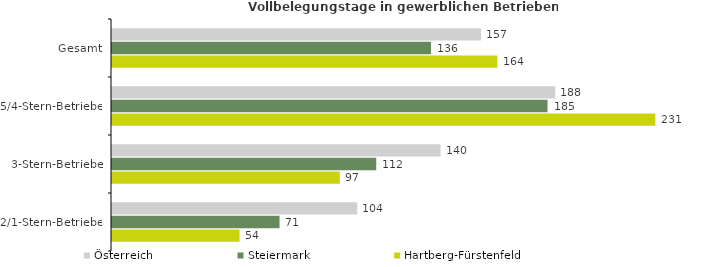
| Category | Österreich | Steiermark | Hartberg-Fürstenfeld |
|---|---|---|---|
| Gesamt | 156.946 | 135.634 | 163.832 |
| 5/4-Stern-Betriebe | 188.443 | 185.178 | 231.019 |
| 3-Stern-Betriebe | 139.696 | 112.345 | 96.875 |
| 2/1-Stern-Betriebe | 104.286 | 71.229 | 54.235 |